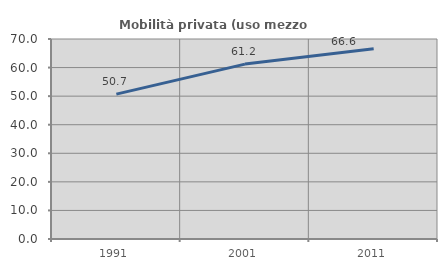
| Category | Mobilità privata (uso mezzo privato) |
|---|---|
| 1991.0 | 50.718 |
| 2001.0 | 61.211 |
| 2011.0 | 66.576 |